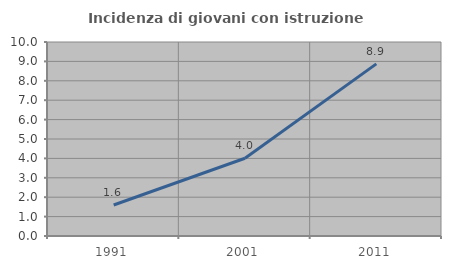
| Category | Incidenza di giovani con istruzione universitaria |
|---|---|
| 1991.0 | 1.596 |
| 2001.0 | 4.007 |
| 2011.0 | 8.871 |